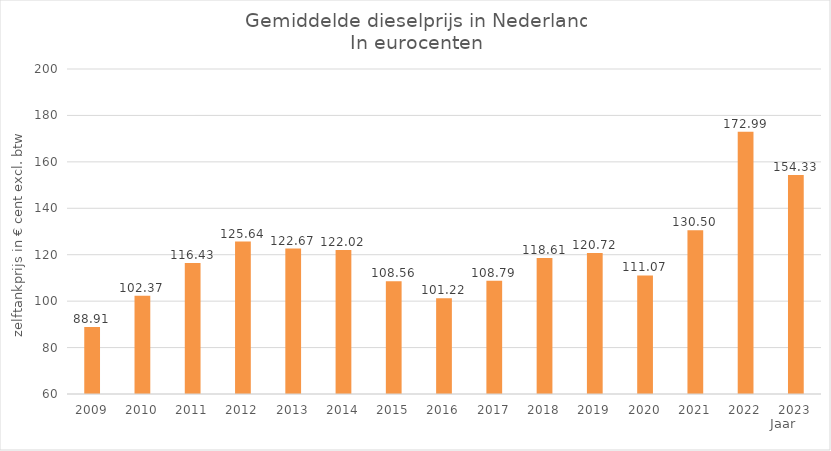
| Category | 2009 |
|---|---|
| 2009.0 | 88.91 |
| 2010.0 | 102.37 |
| 2011.0 | 116.43 |
| 2012.0 | 125.64 |
| 2013.0 | 122.67 |
| 2014.0 | 122.02 |
| 2015.0 | 108.56 |
| 2016.0 | 101.22 |
| 2017.0 | 108.79 |
| 2018.0 | 118.61 |
| 2019.0 | 120.72 |
| 2020.0 | 111.07 |
| 2021.0 | 130.5 |
| 2022.0 | 172.99 |
| 2023.0 | 154.327 |